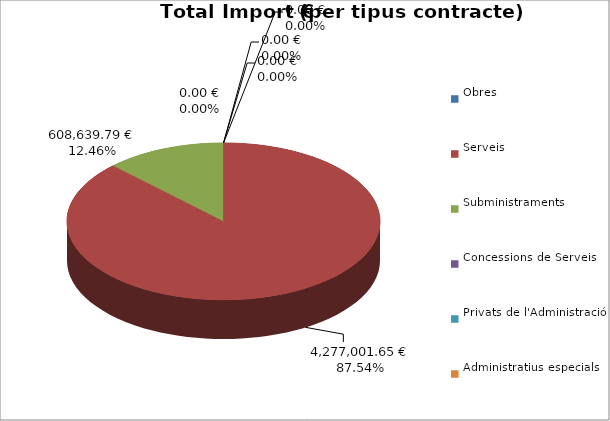
| Category | Total preu
(amb IVA) |
|---|---|
| Obres | 0 |
| Serveis | 4277001.65 |
| Subministraments | 608639.79 |
| Concessions de Serveis | 0 |
| Privats de l'Administració | 0 |
| Administratius especials | 0 |